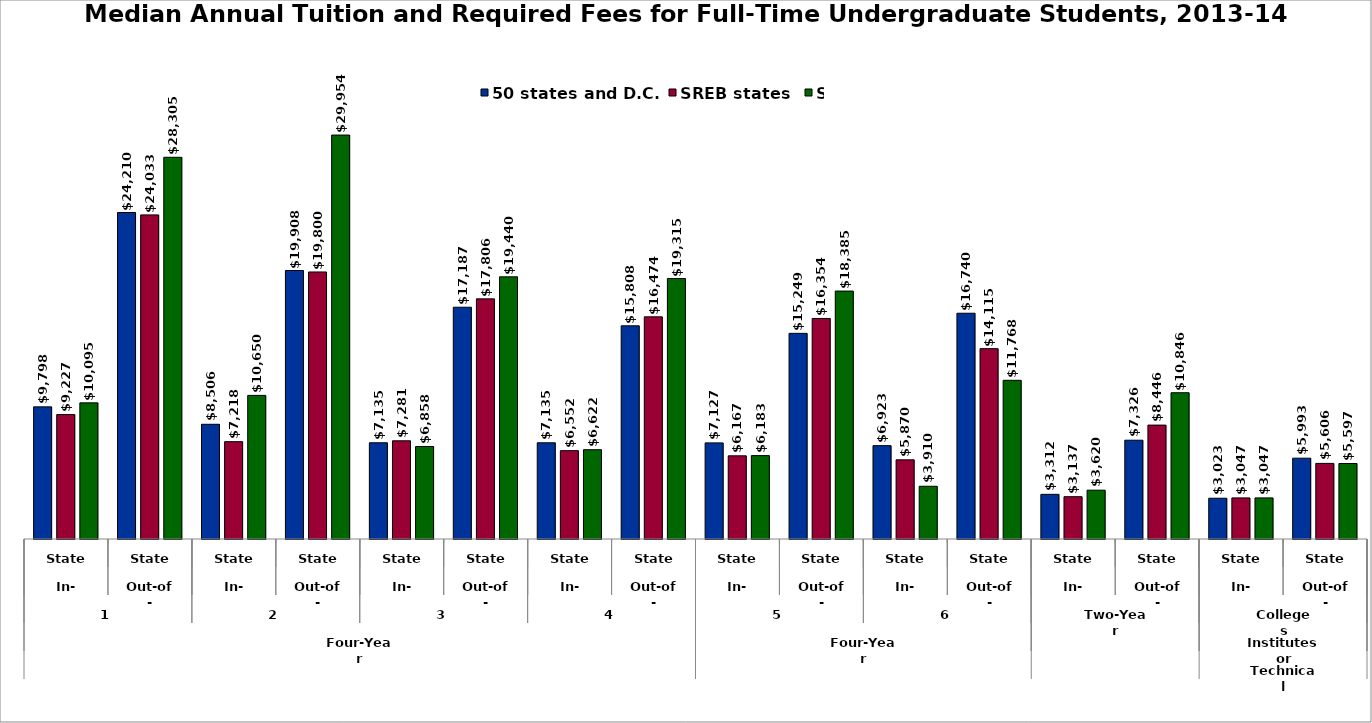
| Category | 50 states and D.C. | SREB states | State |
|---|---|---|---|
| 0 | 9798 | 9226.5 | 10095 |
| 1 | 24210 | 24033 | 28305 |
| 2 | 8506 | 7218 | 10650 |
| 3 | 19908 | 19800 | 29954 |
| 4 | 7135 | 7281 | 6858 |
| 5 | 17186.5 | 17806 | 19440 |
| 6 | 7134.5 | 6552 | 6622 |
| 7 | 15807.5 | 16474 | 19315 |
| 8 | 7127 | 6167 | 6183 |
| 9 | 15249 | 16354 | 18385 |
| 10 | 6923 | 5870 | 3910 |
| 11 | 16740 | 14115 | 11768 |
| 12 | 3312 | 3136.5 | 3620 |
| 13 | 7326 | 8446 | 10846 |
| 14 | 3023 | 3047 | 3047 |
| 15 | 5992.5 | 5606 | 5597 |